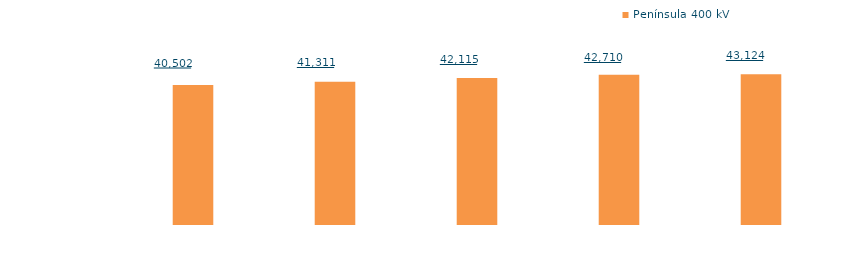
| Category | Península 400 kV |
|---|---|
| 2011 | 19671.35 |
| 2012 | 20108.846 |
| 2013 | 20639.478 |
| 2014 | 21093.512 |
| 2015 (1) | 21178.698 |